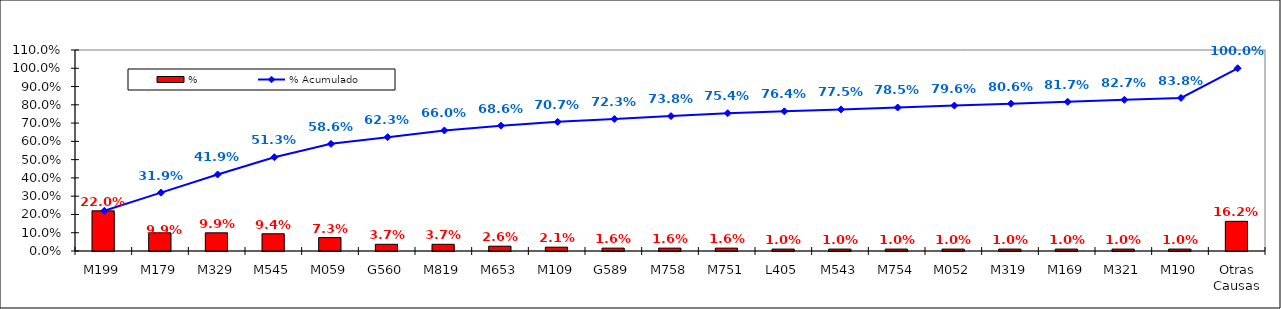
| Category | % |
|---|---|
| M199 | 0.22 |
| M179 | 0.099 |
| M329 | 0.099 |
| M545 | 0.094 |
| M059 | 0.073 |
| G560 | 0.037 |
| M819 | 0.037 |
| M653 | 0.026 |
| M109 | 0.021 |
| G589 | 0.016 |
| M758 | 0.016 |
| M751 | 0.016 |
| L405 | 0.01 |
| M543 | 0.01 |
| M754 | 0.01 |
| M052 | 0.01 |
| M319 | 0.01 |
| M169 | 0.01 |
| M321 | 0.01 |
| M190 | 0.01 |
| Otras Causas | 0.162 |